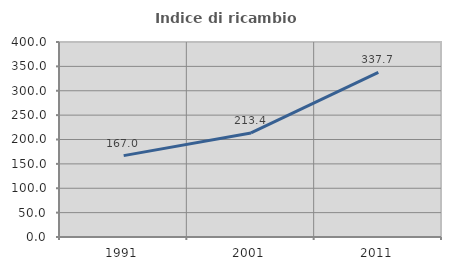
| Category | Indice di ricambio occupazionale  |
|---|---|
| 1991.0 | 166.958 |
| 2001.0 | 213.435 |
| 2011.0 | 337.743 |